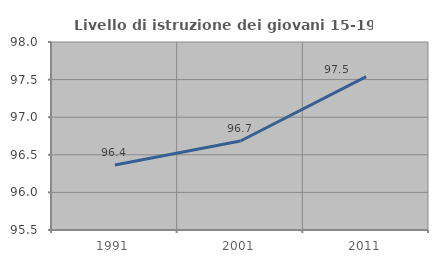
| Category | Livello di istruzione dei giovani 15-19 anni |
|---|---|
| 1991.0 | 96.365 |
| 2001.0 | 96.683 |
| 2011.0 | 97.54 |